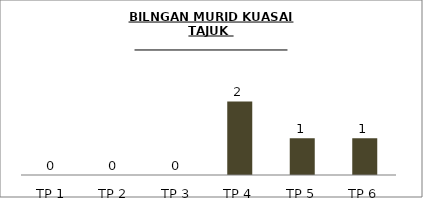
| Category | Series 0 |
|---|---|
| TP 1 | 0 |
| TP 2 | 0 |
| TP 3 | 0 |
| TP 4 | 2 |
| TP 5 | 1 |
| TP 6 | 1 |